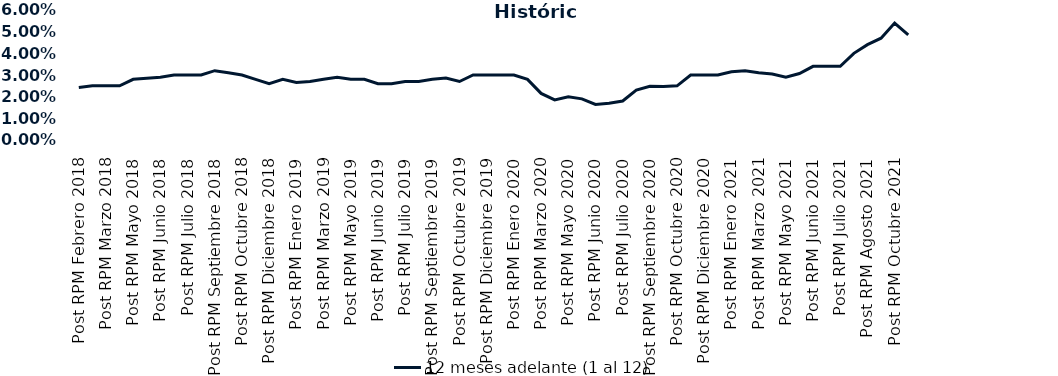
| Category | 12 meses adelante (1 al 12)  |
|---|---|
| Post RPM Febrero 2018 | 0.024 |
| Pre RPM Marzo 2018 | 0.025 |
| Post RPM Marzo 2018 | 0.025 |
| Pre RPM Mayo 2018 | 0.025 |
| Post RPM Mayo 2018 | 0.028 |
| Pre RPM Junio 2018 | 0.028 |
| Post RPM Junio 2018 | 0.029 |
| Pre RPM Julio 2018 | 0.03 |
| Post RPM Julio 2018 | 0.03 |
| Pre RPM Septiembre 2018 | 0.03 |
| Post RPM Septiembre 2018 | 0.032 |
| Pre RPM Octubre 2018 | 0.031 |
| Post RPM Octubre 2018 | 0.03 |
| Pre RPM Diciembre 2018 | 0.028 |
| Post RPM Diciembre 2018 | 0.026 |
| Pre RPM Enero 2019 | 0.028 |
| Post RPM Enero 2019 | 0.026 |
| Pre RPM Marzo 2019 | 0.027 |
| Post RPM Marzo 2019 | 0.028 |
| Pre RPM Mayo 2019 | 0.029 |
| Post RPM Mayo 2019 | 0.028 |
| Pre RPM Junio 2019 | 0.028 |
| Post RPM Junio 2019 | 0.026 |
| Pre RPM Julio 2019 | 0.026 |
| Post RPM Julio 2019 | 0.027 |
| Pre RPM Septiembre 2019 | 0.027 |
| Post RPM Septiembre 2019 | 0.028 |
| Pre RPM Octubre 2019 | 0.029 |
| Post RPM Octubre 2019 | 0.027 |
| Pre RPM Diciembre 2019 | 0.03 |
| Post RPM Diciembre 2019 | 0.03 |
| Pre RPM Enero 2020 | 0.03 |
| Post RPM Enero 2020 | 0.03 |
| Pre RPM Marzo 2020 | 0.028 |
| Post RPM Marzo 2020 | 0.022 |
| Pre RPM Mayo 2020 | 0.018 |
| Post RPM Mayo 2020 | 0.02 |
| Pre RPM Junio 2020 | 0.019 |
| Post RPM Junio 2020 | 0.016 |
| Pre RPM Julio 2020 | 0.017 |
| Post RPM Julio 2020 | 0.018 |
| Pre RPM Septiembre 2020 | 0.023 |
| Post RPM Septiembre 2020 | 0.025 |
| Pre RPM Octubre 2020 | 0.025 |
| Post RPM Octubre 2020 | 0.025 |
| Pre RPM Diciembre 2020 | 0.03 |
| Post RPM Diciembre 2020 | 0.03 |
| Pre RPM Enero 2021 | 0.03 |
| Post RPM Enero 2021 | 0.032 |
| Pre RPM Marzo 2021 | 0.032 |
| Post RPM Marzo 2021 | 0.031 |
| Pre RPM Mayo 2021 | 0.03 |
| Post RPM Mayo 2021 | 0.029 |
| Pre RPM Junio 2021 | 0.031 |
| Post RPM Junio 2021 | 0.034 |
| Pre RPM Julio 2021 | 0.034 |
| Post RPM Julio 2021 | 0.034 |
| Pre RPM Agosto 2021 | 0.04 |
| Post RPM Agosto 2021 | 0.044 |
| Pre RPM Octubre 2021 | 0.047 |
| Post RPM Octubre 2021 | 0.054 |
| Pre RPM Diciembre 2021 | 0.048 |